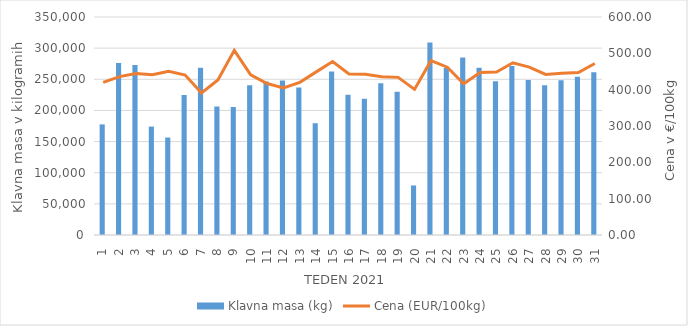
| Category | Klavna masa (kg) |
|---|---|
| 1.0 | 177573 |
| 2.0 | 275951 |
| 3.0 | 272797 |
| 4.0 | 174056 |
| 5.0 | 156508 |
| 6.0 | 224595 |
| 7.0 | 268436 |
| 8.0 | 206193 |
| 9.0 | 205669 |
| 10.0 | 240592 |
| 11.0 | 246325 |
| 12.0 | 248020 |
| 13.0 | 236703 |
| 14.0 | 179478 |
| 15.0 | 262544 |
| 16.0 | 225033 |
| 17.0 | 218950 |
| 18.0 | 243711 |
| 19.0 | 229955 |
| 20.0 | 79521 |
| 21.0 | 309134 |
| 22.0 | 268074 |
| 23.0 | 285151 |
| 24.0 | 268579 |
| 25.0 | 246944 |
| 26.0 | 271319 |
| 27.0 | 248858 |
| 28.0 | 240609 |
| 29.0 | 248383 |
| 30.0 | 253894 |
| 31.0 | 261374 |